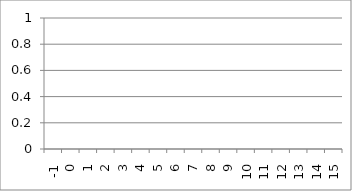
| Category | Frequency |
|---|---|
| -1.0 | 2 |
| 0.0 | 0 |
| 1.0 | 0 |
| 2.0 | 2 |
| 3.0 | 3 |
| 4.0 | 4 |
| 5.0 | 2 |
| 6.0 | 1 |
| 7.0 | 0 |
| 8.0 | 1 |
| 9.0 | 0 |
| 10.0 | 1 |
| 11.0 | 0 |
| 12.0 | 1 |
| 13.0 | 0 |
| 14.0 | 0 |
| 15.0 | 1 |